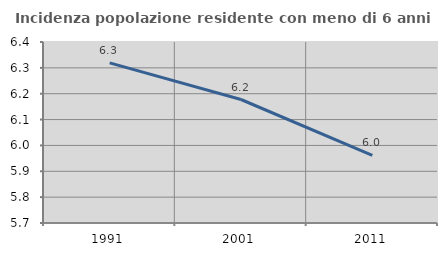
| Category | Incidenza popolazione residente con meno di 6 anni |
|---|---|
| 1991.0 | 6.319 |
| 2001.0 | 6.178 |
| 2011.0 | 5.962 |